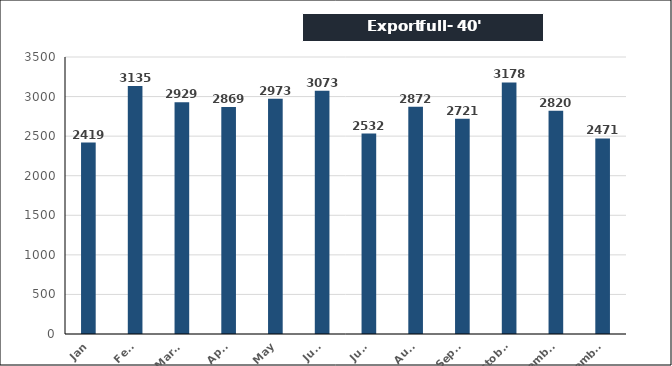
| Category | Export full - 40' |
|---|---|
| Jan | 2419 |
| Feb. | 3135 |
| March | 2929 |
| April | 2869 |
| May | 2973 |
| June | 3073 |
| July | 2532 |
| Aug. | 2872 |
| Sept. | 2721 |
| October | 3178 |
| November | 2820 |
| December | 2471 |